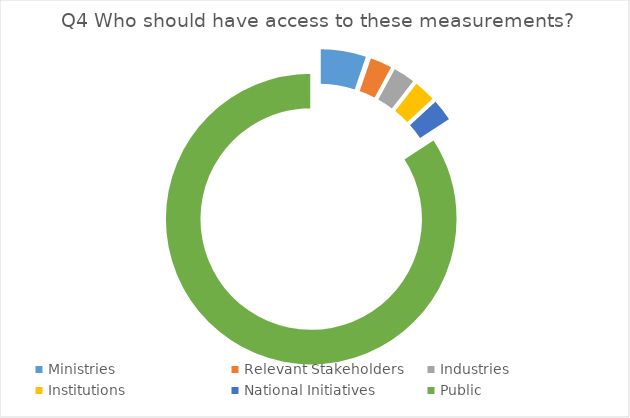
| Category | Series 0 |
|---|---|
| Ministries | 2 |
| Relevant Stakeholders | 1 |
| Industries | 1 |
| Institutions | 1 |
| National Initiatives | 1 |
| Public | 32 |